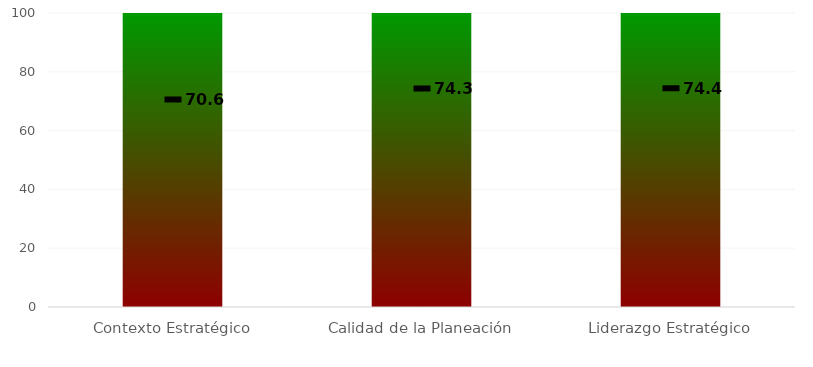
| Category | Rangos |
|---|---|
| Contexto Estratégico | 100 |
| Calidad de la Planeación | 100 |
| Liderazgo Estratégico | 100 |